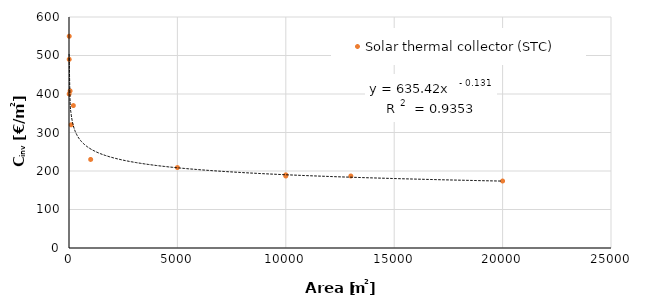
| Category | Solar thermal collector (STC) |
|---|---|
| 10.0 | 490 |
| 50.0 | 408 |
| 13000.0 | 187 |
| 5000.0 | 209 |
| 10000.0 | 187 |
| 20000.0 | 174 |
| 10.0 | 550 |
| 100.0 | 320 |
| 1000.0 | 230 |
| 10000.0 | 190 |
| 6.0 | 400 |
| 200.0 | 370 |